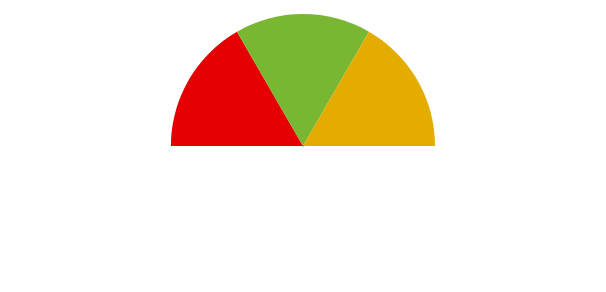
| Category | Przedziały |
|---|---|
| 0 | 180 |
| 1 | 60 |
| 2 | 60 |
| 3 | 60 |